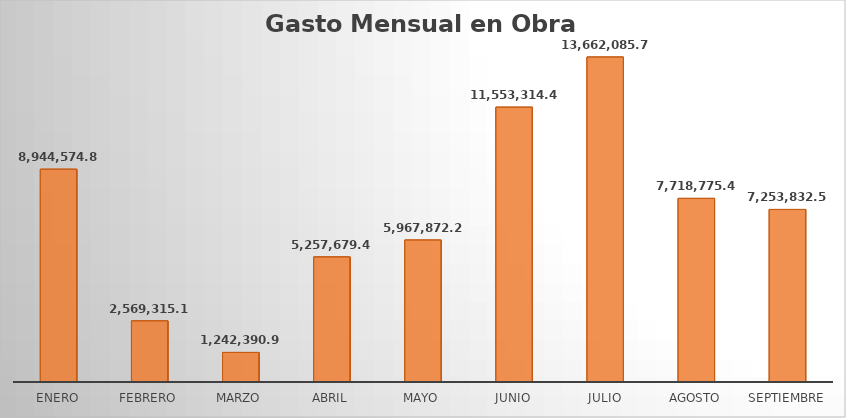
| Category | Monto |
|---|---|
| ENERO | 8944574.8 |
| FEBRERO | 2569315.17 |
| MARZO | 1242390.96 |
| ABRIL | 5257679.43 |
| MAYO | 5967872.23 |
| JUNIO | 11553314.42 |
| JULIO | 13662085.75 |
| AGOSTO | 7718775.42 |
| SEPTIEMBRE | 7253832.51 |